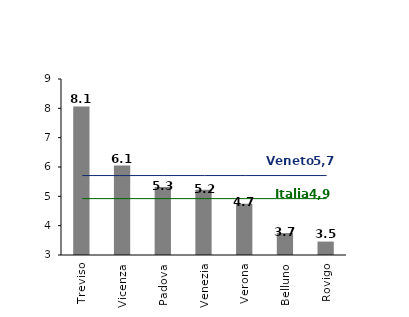
| Category | % |
|---|---|
| Treviso | 8.059 |
| Vicenza | 6.051 |
| Padova | 5.316 |
| Venezia | 5.224 |
| Verona | 4.747 |
| Belluno | 3.748 |
| Rovigo | 3.457 |